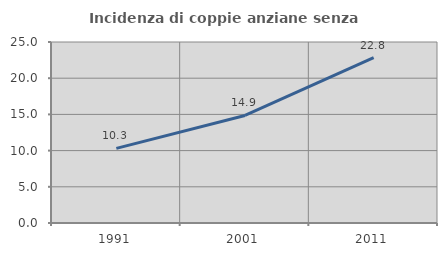
| Category | Incidenza di coppie anziane senza figli  |
|---|---|
| 1991.0 | 10.309 |
| 2001.0 | 14.857 |
| 2011.0 | 22.84 |